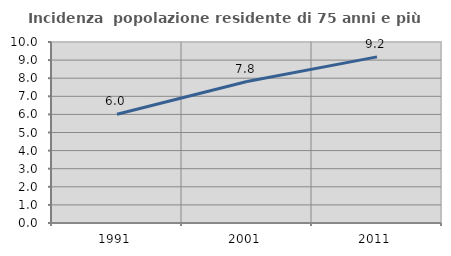
| Category | Incidenza  popolazione residente di 75 anni e più |
|---|---|
| 1991.0 | 6.012 |
| 2001.0 | 7.817 |
| 2011.0 | 9.178 |